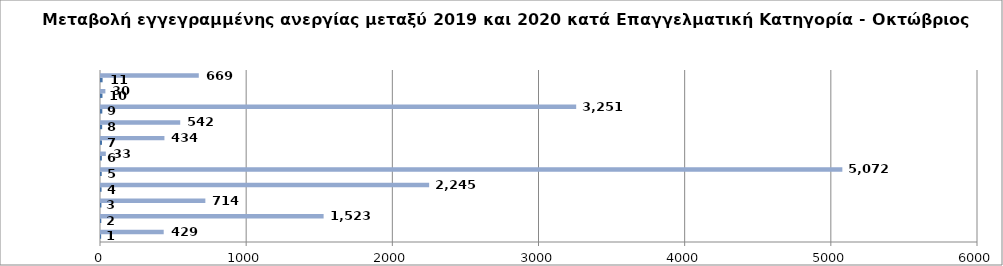
| Category | Series 0 | Series 1 |
|---|---|---|
| 0 | 1 | 429 |
| 1 | 2 | 1523 |
| 2 | 3 | 714 |
| 3 | 4 | 2245 |
| 4 | 5 | 5072 |
| 5 | 6 | 33 |
| 6 | 7 | 434 |
| 7 | 8 | 542 |
| 8 | 9 | 3251 |
| 9 | 10 | 30 |
| 10 | 11 | 669 |